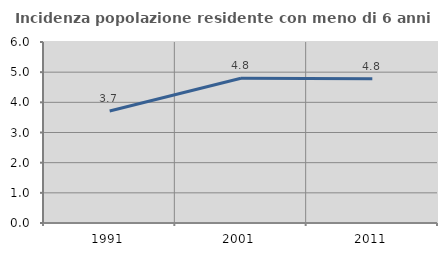
| Category | Incidenza popolazione residente con meno di 6 anni |
|---|---|
| 1991.0 | 3.712 |
| 2001.0 | 4.799 |
| 2011.0 | 4.78 |